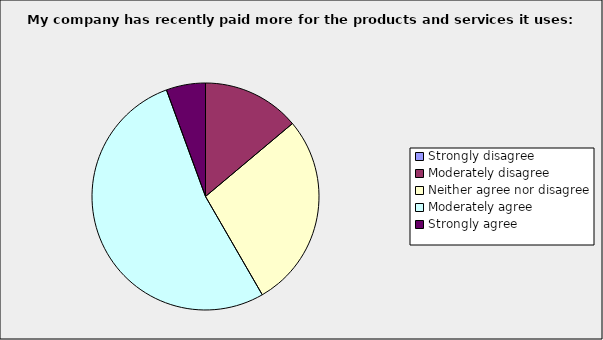
| Category | Series 0 |
|---|---|
| Strongly disagree | 0 |
| Moderately disagree | 0.139 |
| Neither agree nor disagree | 0.278 |
| Moderately agree | 0.528 |
| Strongly agree | 0.056 |